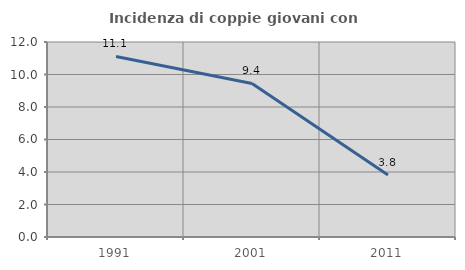
| Category | Incidenza di coppie giovani con figli |
|---|---|
| 1991.0 | 11.111 |
| 2001.0 | 9.449 |
| 2011.0 | 3.81 |